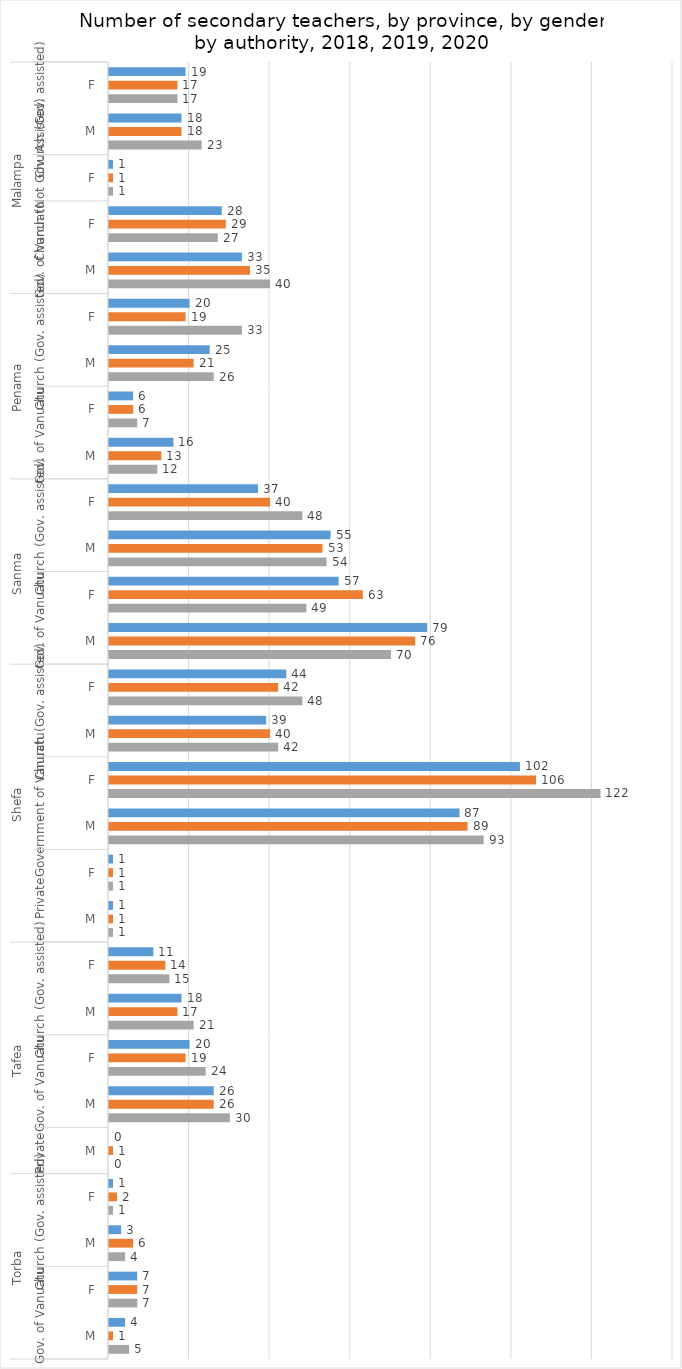
| Category | 2018 | 2019 | 2020 |
|---|---|---|---|
| 0 | 19 | 17 | 17 |
| 1 | 18 | 18 | 23 |
| 2 | 1 | 1 | 1 |
| 3 | 28 | 29 | 27 |
| 4 | 33 | 35 | 40 |
| 5 | 20 | 19 | 33 |
| 6 | 25 | 21 | 26 |
| 7 | 6 | 6 | 7 |
| 8 | 16 | 13 | 12 |
| 9 | 37 | 40 | 48 |
| 10 | 55 | 53 | 54 |
| 11 | 57 | 63 | 49 |
| 12 | 79 | 76 | 70 |
| 13 | 44 | 42 | 48 |
| 14 | 39 | 40 | 42 |
| 15 | 102 | 106 | 122 |
| 16 | 87 | 89 | 93 |
| 17 | 1 | 1 | 1 |
| 18 | 1 | 1 | 1 |
| 19 | 11 | 14 | 15 |
| 20 | 18 | 17 | 21 |
| 21 | 20 | 19 | 24 |
| 22 | 26 | 26 | 30 |
| 23 | 0 | 1 | 0 |
| 24 | 1 | 2 | 1 |
| 25 | 3 | 6 | 4 |
| 26 | 7 | 7 | 7 |
| 27 | 4 | 1 | 5 |